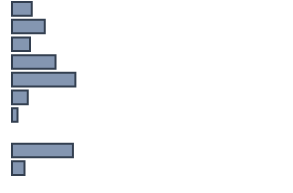
| Category | Series 0 |
|---|---|
| 0 | 7.3 |
| 1 | 12 |
| 2 | 6.6 |
| 3 | 16 |
| 4 | 23.3 |
| 5 | 5.8 |
| 6 | 2 |
| 7 | 0 |
| 8 | 22.4 |
| 9 | 4.6 |